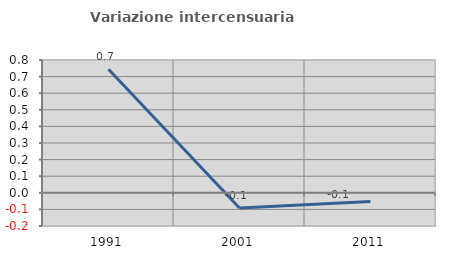
| Category | Variazione intercensuaria annua |
|---|---|
| 1991.0 | 0.744 |
| 2001.0 | -0.091 |
| 2011.0 | -0.053 |